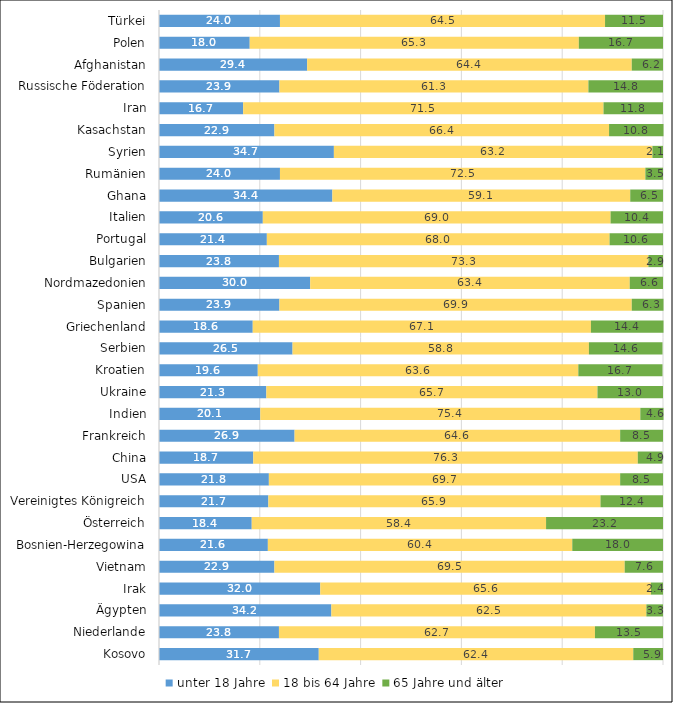
| Category | unter 18 Jahre | 18 bis 64 Jahre | 65 Jahre und älter |
|---|---|---|---|
| Kosovo | 31.7 | 62.4 | 5.9 |
| Niederlande | 23.8 | 62.7 | 13.5 |
| Ägypten | 34.2 | 62.5 | 3.3 |
| Irak | 32 | 65.6 | 2.4 |
| Vietnam | 22.9 | 69.5 | 7.6 |
| Bosnien-Herzegowina | 21.6 | 60.4 | 18 |
| Österreich | 18.4 | 58.4 | 23.2 |
| Vereinigtes Königreich | 21.7 | 65.9 | 12.4 |
| USA | 21.8 | 69.7 | 8.5 |
| China | 18.7 | 76.3 | 4.9 |
| Frankreich | 26.9 | 64.6 | 8.5 |
| Indien | 20.1 | 75.4 | 4.6 |
| Ukraine | 21.3 | 65.7 | 13 |
| Kroatien | 19.6 | 63.6 | 16.7 |
| Serbien | 26.5 | 58.8 | 14.6 |
| Griechenland | 18.6 | 67.1 | 14.4 |
| Spanien | 23.9 | 69.9 | 6.3 |
| Nordmazedonien | 30 | 63.4 | 6.6 |
| Bulgarien | 23.8 | 73.3 | 2.9 |
| Portugal | 21.4 | 68 | 10.6 |
| Italien | 20.6 | 69 | 10.4 |
| Ghana | 34.4 | 59.1 | 6.5 |
| Rumänien | 24 | 72.5 | 3.5 |
| Syrien | 34.7 | 63.2 | 2.1 |
| Kasachstan | 22.9 | 66.4 | 10.8 |
| Iran | 16.7 | 71.5 | 11.8 |
| Russische Föderation | 23.9 | 61.3 | 14.8 |
| Afghanistan | 29.4 | 64.4 | 6.2 |
| Polen | 18 | 65.3 | 16.7 |
| Türkei | 24 | 64.5 | 11.5 |